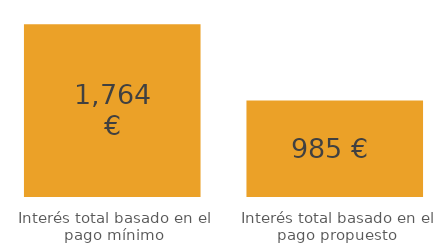
| Category | Series 0 |
|---|---|
| Interés total basado en el pago mínimo | 1763.952 |
| Interés total basado en el pago propuesto | 984.811 |